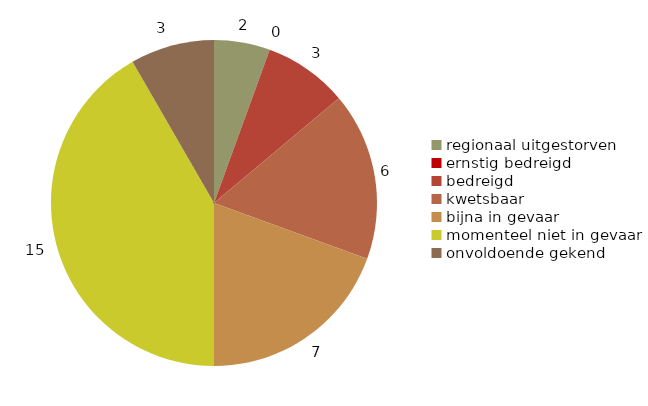
| Category | Series 0 |
|---|---|
| regionaal uitgestorven | 2 |
| ernstig bedreigd | 0 |
| bedreigd | 3 |
| kwetsbaar | 6 |
| bijna in gevaar | 7 |
| momenteel niet in gevaar | 15 |
| onvoldoende gekend | 3 |